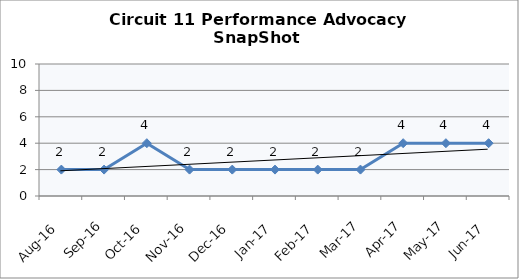
| Category | Circuit 11 |
|---|---|
| Aug-16 | 2 |
| Sep-16 | 2 |
| Oct-16 | 4 |
| Nov-16 | 2 |
| Dec-16 | 2 |
| Jan-17 | 2 |
| Feb-17 | 2 |
| Mar-17 | 2 |
| Apr-17 | 4 |
| May-17 | 4 |
| Jun-17 | 4 |